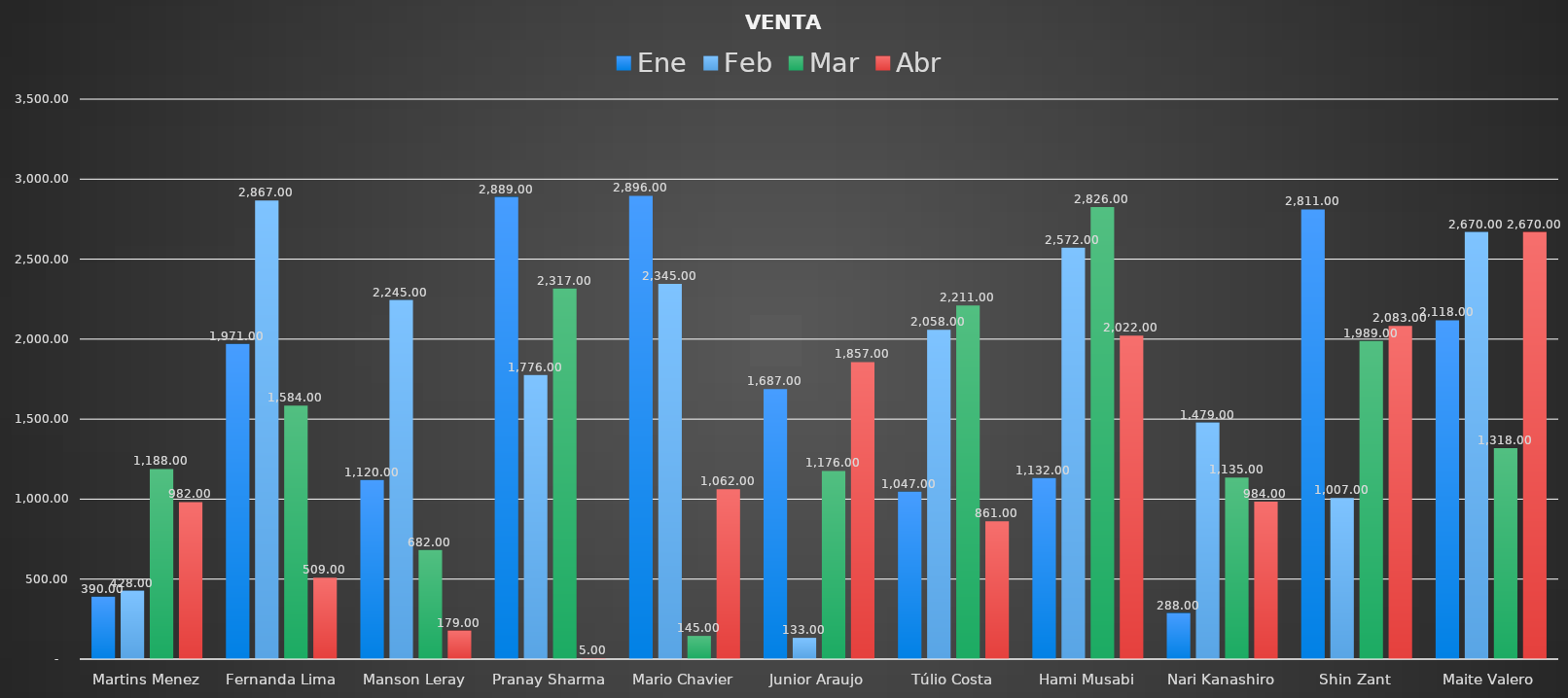
| Category | Ene | Feb | Mar | Abr |
|---|---|---|---|---|
| Martins Menez | 390 | 428 | 1188 | 982 |
| Fernanda Lima | 1971 | 2867 | 1584 | 509 |
| Manson Leray | 1120 | 2245 | 682 | 179 |
| Pranay Sharma | 2889 | 1776 | 2317 | 5 |
| Mario Chavier | 2896 | 2345 | 145 | 1062 |
| Junior Araujo | 1687 | 133 | 1176 | 1857 |
| Túlio Costa | 1047 | 2058 | 2211 | 861 |
| Hami Musabi | 1132 | 2572 | 2826 | 2022 |
| Nari Kanashiro | 288 | 1479 | 1135 | 984 |
| Shin Zant | 2811 | 1007 | 1989 | 2083 |
| Maite Valero | 2118 | 2670 | 1318 | 2670 |